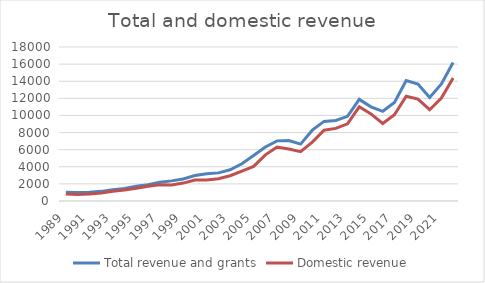
| Category | Total revenue and grants | Domestic revenue |
|---|---|---|
| 1989.0 | 1013.9 | 824.2 |
| 1990.0 | 988.9 | 749.7 |
| 1991.0 | 1026.2 | 811.4 |
| 1992.0 | 1125.5 | 929.2 |
| 1993.0 | 1308.7 | 1127.1 |
| 1994.0 | 1451.7 | 1286.9 |
| 1995.0 | 1721.6 | 1484.9 |
| 1996.0 | 1897.7 | 1727.6 |
| 1997.0 | 2201.8 | 1889.8 |
| 1998.0 | 2352.9 | 1882.6 |
| 1999.0 | 2569 | 2091.9 |
| 2000.0 | 2975.8 | 2459.4 |
| 2001.0 | 3184.8 | 2465.8 |
| 2002.0 | 3286.4 | 2595 |
| 2003.0 | 3650.1 | 2957.1 |
| 2004.0 | 4349.6 | 3499.9 |
| 2005.0 | 5326.8 | 4043.7 |
| 2006.0 | 6311.6 | 5397 |
| 2007.0 | 7028.6 | 6307.6 |
| 2008.0 | 7073.3 | 6071.3 |
| 2009.0 | 6651.3 | 5773.8 |
| 2010.0 | 8278.9 | 6887.8 |
| 2011.0 | 9304.9 | 8279.9 |
| 2012.0 | 9418.9 | 8488.1 |
| 2013.0 | 9897.5 | 9020 |
| 2014.0 | 11874.9 | 11007.4 |
| 2015.0 | 11003.1 | 10183.6 |
| 2016.0 | 10485.5 | 9055.4 |
| 2017.0 | 11525.1 | 10085.2 |
| 2018.0 | 14085.1 | 12249.4 |
| 2019.0 | 13680.5 | 11904.9 |
| 2020.0 | 12093.3 | 10668.3 |
| 2021.0 | 13674.5 | 12031.5 |
| 2022.0 | 16190.2 | 14365.3 |